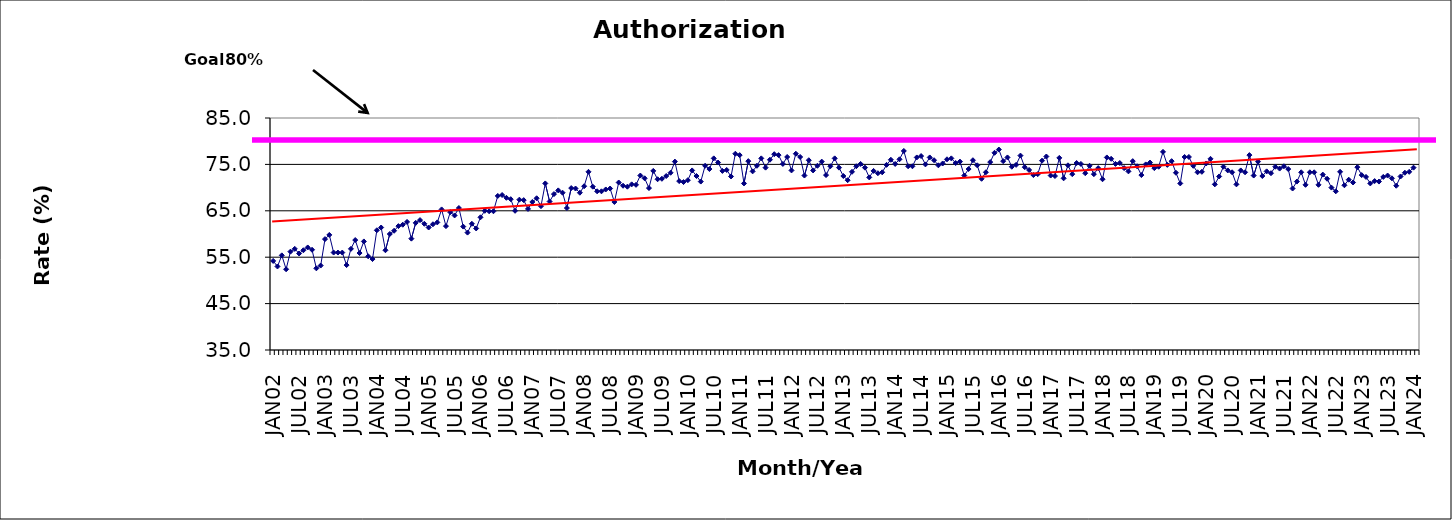
| Category | Series 0 |
|---|---|
| JAN02 | 54.2 |
| FEB02 | 53 |
| MAR02 | 55.4 |
| APR02 | 52.4 |
| MAY02 | 56.2 |
| JUN02 | 56.8 |
| JUL02 | 55.8 |
| AUG02 | 56.5 |
| SEP02 | 57.1 |
| OCT02 | 56.6 |
| NOV02 | 52.6 |
| DEC02 | 53.2 |
| JAN03 | 58.9 |
| FEB03 | 59.8 |
| MAR03 | 56 |
| APR03 | 56 |
| MAY03 | 56 |
| JUN03 | 53.3 |
| JUL03 | 56.8 |
| AUG03 | 58.7 |
| SEP03 | 55.9 |
| OCT03 | 58.4 |
| NOV03 | 55.2 |
| DEC03 | 54.6 |
| JAN04 | 60.8 |
| FEB04 | 61.4 |
| MAR04 | 56.5 |
| APR04 | 60 |
| MAY04 | 60.7 |
| JUN04 | 61.7 |
| JUL04 | 62 |
| AUG04 | 62.6 |
| SEP04 | 59 |
| OCT04 | 62.4 |
| NOV04 | 63 |
| DEC04 | 62.2 |
| JAN05 | 61.4 |
| FEB05 | 62.1 |
| MAR05 | 62.5 |
| APR05 | 65.3 |
| MAY05 | 61.7 |
| JUN05 | 64.7 |
| JUL05 | 64 |
| AUG05 | 65.6 |
| SEP05 | 61.6 |
| OCT05 | 60.3 |
| NOV05 | 62.2 |
| DEC05 | 61.2 |
| JAN06 | 63.6 |
| FEB06 | 65 |
| MAR06 | 64.9 |
| APR06 | 64.9 |
| MAY06 | 68.2 |
| JUN06 | 68.4 |
| JUL06 | 67.8 |
| AUG06 | 67.5 |
| SEP06 | 65 |
| OCT06 | 67.4 |
| NOV06 | 67.3 |
| DEC06 | 65.4 |
| JAN07 | 66.9 |
| FEB07 | 67.7 |
| MAR07 | 66 |
| APR07 | 70.9 |
| MAY07 | 67 |
| JUN07 | 68.6 |
| JUL07 | 69.4 |
| AUG07 | 68.9 |
| SEP07 | 65.6 |
| OCT07 | 69.9 |
| NOV07 | 69.8 |
| DEC07 | 68.9 |
| JAN08 | 70.3 |
| FEB08 | 73.4 |
| MAR08 | 70.2 |
| APR08 | 69.2 |
| MAY08 | 69.2 |
| JUN08 | 69.6 |
| JUL08 | 69.8 |
| AUG08 | 66.9 |
| SEP08 | 71.1 |
| OCT08 | 70.4 |
| NOV08 | 70.2 |
| DEC08 | 70.7 |
| JAN09 | 70.6 |
| FEB09 | 72.6 |
| MAR09 | 72 |
| APR09 | 69.9 |
| MAY09 | 73.6 |
| JUN09 | 71.8 |
| JUL09 | 71.9 |
| AUG09 | 72.5 |
| SEP09 | 73.2 |
| OCT09 | 75.6 |
| NOV09 | 71.4 |
| DEC09 | 71.2 |
| JAN10 | 71.6 |
| FEB10 | 73.7 |
| MAR10 | 72.5 |
| APR10 | 71.3 |
| MAY10 | 74.7 |
| JUN10 | 74 |
| JUL10 | 76.3 |
| AUG10 | 75.4 |
| SEP10 | 73.6 |
| OCT10 | 73.8 |
| NOV10 | 72.4 |
| DEC10 | 77.3 |
| JAN11 | 77 |
| FEB11 | 70.9 |
| MAR11 | 75.7 |
| APR11 | 73.5 |
| MAY11 | 74.7 |
| JUN11 | 76.3 |
| JUL11 | 74.3 |
| AUG11 | 76 |
| SEP11 | 77.2 |
| OCT11 | 77 |
| NOV11 | 75.1 |
| DEC11 | 76.6 |
| JAN12 | 73.7 |
| FEB12 | 77.3 |
| MAR12 | 76.6 |
| APR12 | 72.6 |
| MAY12 | 75.9 |
| JUN12 | 73.7 |
| JUL12 | 74.7 |
| AUG12 | 75.6 |
| SEP12 | 72.7 |
| OCT12 | 74.6 |
| NOV12 | 76.3 |
| DEC12 | 74.3 |
| JAN13 | 72.5 |
| FEB13 | 71.6 |
| MAR13 | 73.4 |
| APR13 | 74.6 |
| MAY13 | 75.1 |
| JUN13 | 74.3 |
| JUL13 | 72.2 |
| AUG13 | 73.6 |
| SEP13 | 73.1 |
| OCT13 | 73.3 |
| NOV13 | 74.9 |
| DEC13 | 76 |
| JAN14 | 75.1 |
| FEB14 | 76.1 |
| MAR14 | 77.9 |
| APR14 | 74.6 |
| MAY14 | 74.6 |
| JUN14 | 76.5 |
| JUL14 | 76.8 |
| AUG14 | 75 |
| SEP14 | 76.5 |
| OCT14 | 75.9 |
| NOV14 | 74.8 |
| DEC14 | 75.2 |
| JAN15 | 76.1 |
| FEB15 | 76.3 |
| MAR15 | 75.3 |
| APR15 | 75.6 |
| MAY15 | 72.6 |
| JUN15 | 74 |
| JUL15 | 75.9 |
| AUG15 | 74.8 |
| SEP15 | 71.9 |
| OCT15 | 73.3 |
| NOV15 | 75.5 |
| DEC15 | 77.5 |
| JAN16 | 78.2 |
| FEB16 | 75.7 |
| MAR16 | 76.5 |
| APR16 | 74.5 |
| MAY16 | 74.9 |
| JUN16 | 76.9 |
| JUL16 | 74.4 |
| AUG16 | 73.8 |
| SEP16 | 72.7 |
| OCT16 | 72.9 |
| NOV16 | 75.8 |
| DEC16 | 76.7 |
| JAN17 | 72.6 |
| FEB17 | 72.5 |
| MAR17 | 76.4 |
| APR17 | 72 |
| MAY17 | 74.8 |
| JUN17 | 72.9 |
| JUL17 | 75.3 |
| AUG17 | 75.1 |
| SEP17 | 73.1 |
| OCT17 | 74.7 |
| NOV17 | 72.9 |
| DEC17 | 74.2 |
| JAN18 | 71.8 |
| FEB18 | 76.5 |
| MAR18 | 76.2 |
| APR18 | 75.1 |
| MAY18 | 75.3 |
| JUN18 | 74.2 |
| JUL18 | 73.5 |
| AUG18 | 75.7 |
| SEP18 | 74.6 |
| OCT18 | 72.7 |
| NOV18 | 75 |
| DEC18 | 75.4 |
| JAN19 | 74.2 |
| FEB19 | 74.5 |
| MAR19 | 77.7 |
| APR19 | 74.9 |
| MAY19 | 75.7 |
| JUN19 | 73.2 |
| JUL19 | 70.9 |
| AUG19 | 76.6 |
| SEP19 | 76.6 |
| OCT19 | 74.7 |
| NOV19 | 73.3 |
| DEC19 | 73.4 |
| JAN20 | 75.2 |
| FEB20 | 76.2 |
| MAR20 | 70.7 |
| APR20 | 72.4 |
| MAY20 | 74.5 |
| JUN20 | 73.7 |
| JUL20 | 73.3 |
| AUG20 | 70.7 |
| SEP20 | 73.7 |
| OCT20 | 73.3 |
| NOV20 | 77 |
| DEC20 | 72.6 |
| JAN21 | 75.6 |
| FEB21 | 72.5 |
| MAR21 | 73.5 |
| APR21 | 73.1 |
| MAY21 | 74.5 |
| JUN21 | 74.1 |
| JUL21 | 74.6 |
| AUG21 | 74 |
| SEP21 | 69.8 |
| OCT21 | 71.3 |
| NOV21 | 73.3 |
| DEC21 | 70.6 |
| JAN22 | 73.3 |
| FEB22 | 73.3 |
| MAR22 | 70.6 |
| APR22 | 72.8 |
| MAY22 | 71.9 |
| JUN22 | 70 |
| JUL22 | 69.2 |
| AUG22 | 73.4 |
| SEP22 | 70.5 |
| OCT22 | 71.7 |
| NOV22 | 71.1 |
| DEC22 | 74.4 |
| JAN23 | 72.7 |
| FEB23 | 72.3 |
| MAR23 | 70.9 |
| APR23 | 71.4 |
| MAY23 | 71.3 |
| JUN23 | 72.3 |
| JUL23 | 72.6 |
| AUG23 | 72 |
| SEP23 | 70.4 |
| OCT23 | 72.4 |
| NOV23 | 73.2 |
| DEC23 | 73.4 |
| JAN24 | 74.3 |